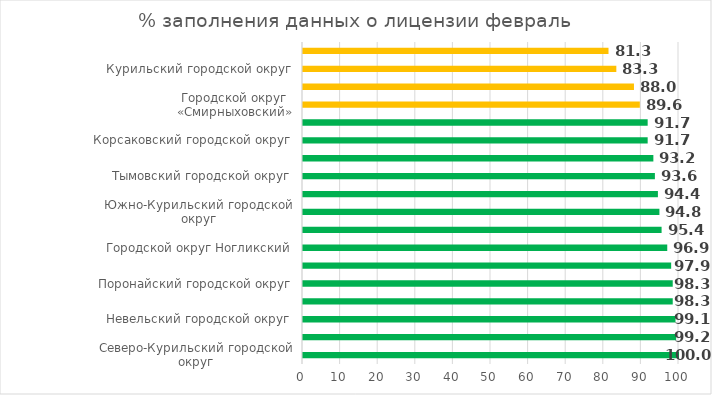
| Category | Series 0 |
|---|---|
| Северо-Курильский городской округ | 100 |
| Городской округ «Долинский» | 99.242 |
| Невельский городской округ | 99.074 |
| Городской округ «Александровск-Сахалинский район»  | 98.333 |
| Поронайский городской округ | 98.333 |
| Углегорский городской округ | 97.917 |
| Городской округ Ногликский | 96.875 |
| Городской округ«Охинский» | 95.37 |
| Южно-Курильский городской округ | 94.792 |
| Городской округ "город Южно-Сахалинск" | 94.391 |
| Тымовский городской округ | 93.59 |
| Анивский городской округ | 93.182 |
| Корсаковский городской округ | 91.667 |
| Томаринский городской округ | 91.667 |
| Городской округ «Смирныховский» | 89.583 |
| Холмский городской округ | 88.021 |
| Курильский городской округ | 83.333 |
| Макаровский городской округ | 81.25 |